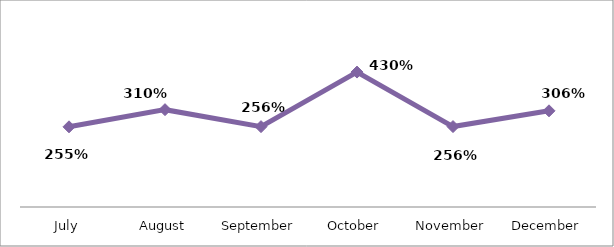
| Category | PERCENTAGE |
|---|---|
| July | 2.554 |
| August | 3.1 |
| September | 2.559 |
| October | 4.297 |
| November | 2.561 |
| December | 3.063 |